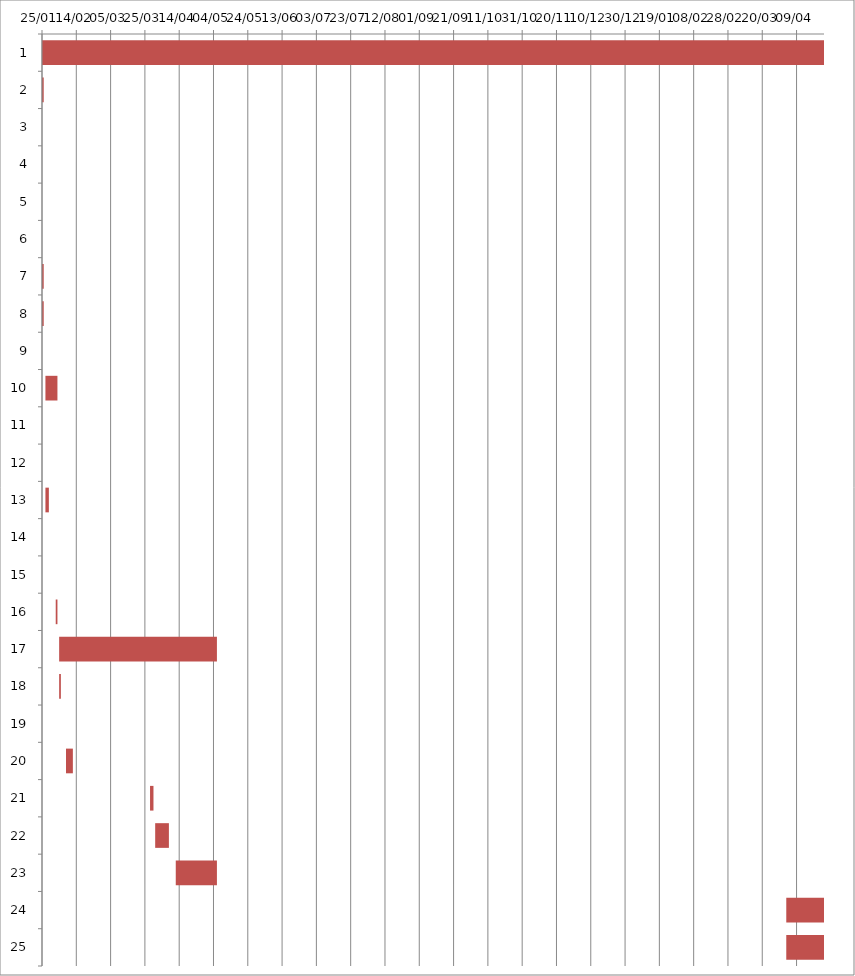
| Category | Fecha de inicio | DURACIÓN |
|---|---|---|
| 0 | 1/25/16 | 697 |
| 1 | 1/25/16 | 1 |
| 2 | 1/25/16 | 0 |
| 3 | 1/25/16 | 0 |
| 4 | 1/25/16 | 0 |
| 5 | 1/25/16 | 0 |
| 6 | 1/25/16 | 1 |
| 7 | 1/25/16 | 1 |
| 8 | 1/26/16 | 0 |
| 9 | 1/27/16 | 7 |
| 10 | 1/27/16 | 0 |
| 11 | 1/28/16 | 0 |
| 12 | 1/27/16 | 2 |
| 13 | 2/1/16 | 0 |
| 14 | 2/2/16 | 0 |
| 15 | 2/2/16 | 1 |
| 16 | 2/4/16 | 92 |
| 17 | 2/4/16 | 1 |
| 18 | 2/5/16 | 0 |
| 19 | 2/8/16 | 4 |
| 20 | 3/28/16 | 2 |
| 21 | 3/31/16 | 8 |
| 22 | 4/12/16 | 24 |
| 23 | 4/3/17 | 263 |
| 24 | 4/3/17 | 150 |